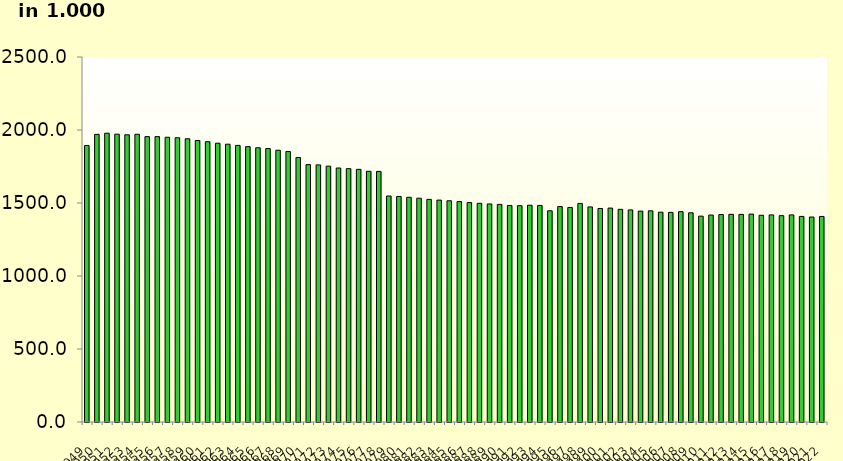
| Category | Series 1 |
|---|---|
| 1949.0 | 1893.953 |
| 1950.0 | 1970.184 |
| 1951.0 | 1977.979 |
| 1952.0 | 1971.47 |
| 1953.0 | 1967.121 |
| 1954.0 | 1970.828 |
| 1955.0 | 1954.593 |
| 1956.0 | 1954.555 |
| 1957.0 | 1950.295 |
| 1958.0 | 1946.897 |
| 1959.0 | 1939.994 |
| 1960.0 | 1928.011 |
| 1961.0 | 1919.647 |
| 1962.0 | 1909.489 |
| 1963.0 | 1902.815 |
| 1964.0 | 1894.676 |
| 1965.0 | 1886.1 |
| 1966.0 | 1878.213 |
| 1967.0 | 1872.976 |
| 1968.0 | 1861.305 |
| 1969.0 | 1852.6 |
| 1970.0 | 1811.5 |
| 1971.0 | 1762.9 |
| 1972.0 | 1761.1 |
| 1973.0 | 1752.458 |
| 1974.0 | 1739.705 |
| 1975.0 | 1735.303 |
| 1976.0 | 1730.501 |
| 1977.0 | 1717.244 |
| 1978.0 | 1716.207 |
| 1979.0 | 1548 |
| 1980.0 | 1545.1 |
| 1981.0 | 1539.1 |
| 1982.0 | 1532.7 |
| 1983.0 | 1524.8 |
| 1984.0 | 1519.9 |
| 1985.0 | 1515.3 |
| 1986.0 | 1509.9 |
| 1987.0 | 1502.6 |
| 1988.0 | 1497.8 |
| 1989.0 | 1493.5 |
| 1990.0 | 1490.4 |
| 1991.0 | 1483.2 |
| 1992.0 | 1481.9 |
| 1993.0 | 1484.7 |
| 1994.0 | 1483.3 |
| 1995.0 | 1446.9 |
| 1996.0 | 1475.4 |
| 1997.0 | 1469.6 |
| 1998.0 | 1496.8 |
| 1999.0 | 1473.118 |
| 2000.0 | 1462.5 |
| 2001.0 | 1465.286 |
| 2002.0 | 1456.7 |
| 2003.0 | 1452.682 |
| 2004.0 | 1444.4 |
| 2005.0 | 1446.464 |
| 2006.0 | 1437.2 |
| 2007.0 | 1435.682 |
| 2008.0 | 1440.5 |
| 2009.0 | 1432.8 |
| 2010.0 | 1410 |
| 2011.0 | 1417.6 |
| 2012.0 | 1420.7 |
| 2013.0 | 1422.5 |
| 2014.0 | 1422 |
| 2015.0 | 1424.1 |
| 2016.0 | 1415.98 |
| 2017.0 | 1418.5 |
| 2018.0 | 1413.4 |
| 2019.0 | 1418.5 |
| 2020.0 | 1408.1 |
| 2021.0 | 1403.9 |
| 2022.0 | 1407.9 |